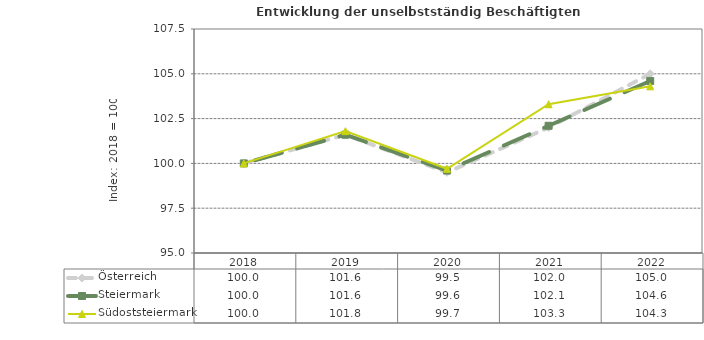
| Category | Österreich | Steiermark | Südoststeiermark |
|---|---|---|---|
| 2022.0 | 105 | 104.6 | 104.3 |
| 2021.0 | 102 | 102.1 | 103.3 |
| 2020.0 | 99.5 | 99.6 | 99.7 |
| 2019.0 | 101.6 | 101.6 | 101.8 |
| 2018.0 | 100 | 100 | 100 |